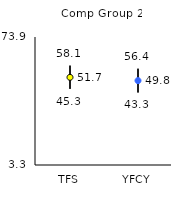
| Category | 25th | 75th | Mean |
|---|---|---|---|
| TFS | 45.3 | 58.1 | 51.65 |
| YFCY | 43.3 | 56.4 | 49.84 |